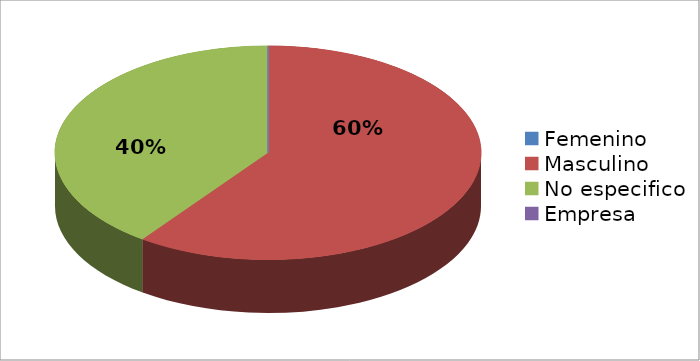
| Category | Series 0 |
|---|---|
| Femenino | 0 |
| Masculino | 3 |
| No especifico | 2 |
| Empresa | 0 |